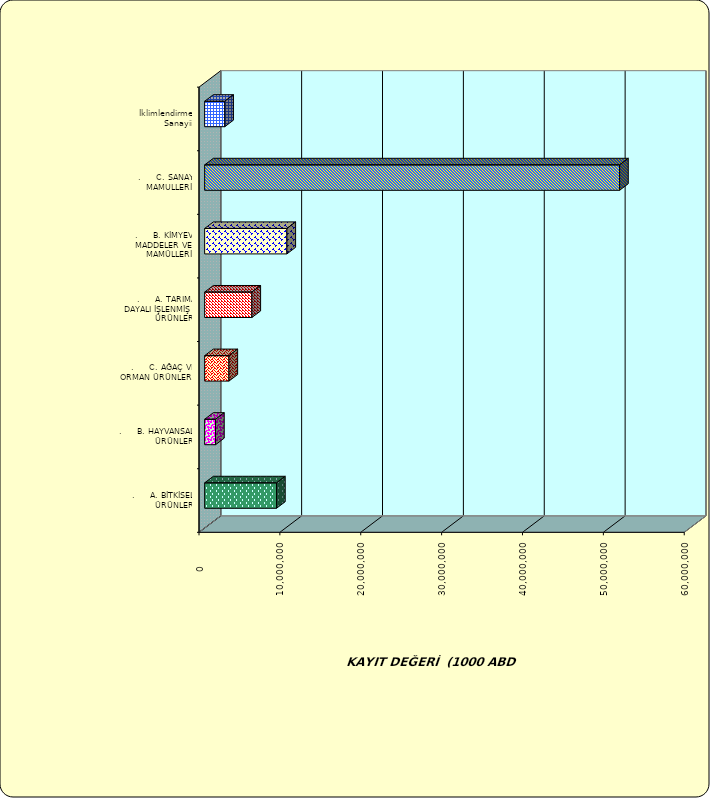
| Category | Series 0 |
|---|---|
| .     A. BİTKİSEL ÜRÜNLER | 8885775.253 |
| .     B. HAYVANSAL ÜRÜNLER | 1347680.658 |
| .     C. AĞAÇ VE ORMAN ÜRÜNLERİ | 3002980.55 |
| .     A. TARIMA DAYALI İŞLENMİŞ ÜRÜNLER | 5842642.293 |
| .     B. KİMYEVİ MADDELER VE MAMÜLLERİ | 10169983.788 |
| .     C. SANAYİ MAMULLERİ | 51307140.793 |
|  İklimlendirme Sanayii | 2486472.538 |